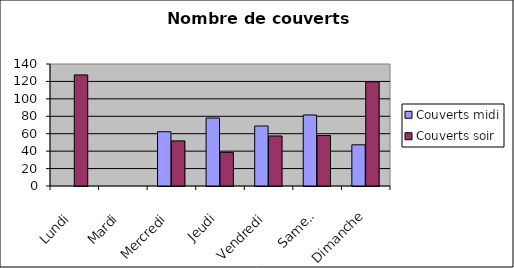
| Category | Couverts |
|---|---|
| Lundi | 127.5 |
| Mardi | 0 |
| Mercredi | 51.75 |
| Jeudi | 38.6 |
| Vendredi | 57.4 |
| Samedi | 58 |
| Dimanche | 119.5 |